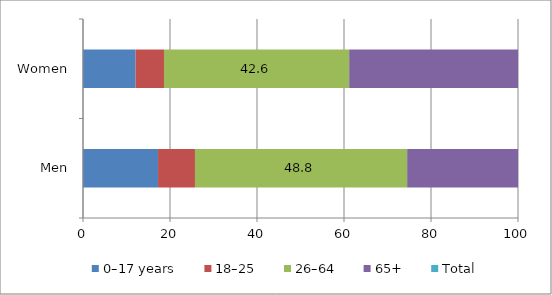
| Category | 0–17 years | 18–25 | 26–64 | 65+ | Total |
|---|---|---|---|---|---|
| Men | 17.254 | 8.485 | 48.78 | 25.481 | 100 |
| Women | 12.077 | 6.54 | 42.571 | 38.812 | 100 |